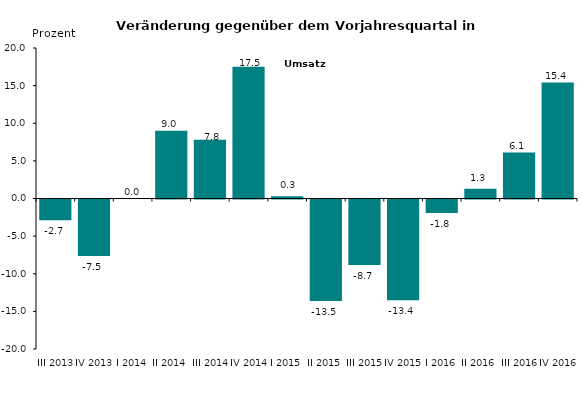
| Category | -2,7 -7,5 0,0 9,0 7,8 17,5 0,3 -13,5 -8,7 -13,4 -1,8 1,3 6,1 15,4 |
|---|---|
| III 2013 | -2.749 |
| IV 2013 | -7.5 |
| I 2014 | 0 |
| II 2014 | 9 |
| III 2014 | 7.8 |
| IV 2014 | 17.5 |
| I 2015 | 0.3 |
| II 2015 | -13.5 |
| III 2015 | -8.7 |
| IV 2015 | -13.4 |
| I 2016 | -1.8 |
| II 2016 | 1.3 |
| III 2016 | 6.1 |
| IV 2016 | 15.4 |